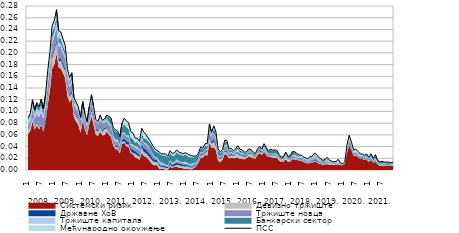
| Category | ПСС |
|---|---|
| 0 | 0.089 |
| 1 | 0.097 |
| 2 | 0.12 |
| 3 | 0.102 |
| 4 | 0.115 |
| 5 | 0.108 |
| 6 | 0.121 |
| 7 | 0.104 |
| 8 | 0.129 |
| 9 | 0.17 |
| 10 | 0.202 |
| 11 | 0.246 |
| 12 | 0.255 |
| 13 | 0.274 |
| 14 | 0.238 |
| 15 | 0.235 |
| 16 | 0.223 |
| 17 | 0.213 |
| 18 | 0.173 |
| 19 | 0.158 |
| 20 | 0.166 |
| 21 | 0.124 |
| 22 | 0.116 |
| 23 | 0.108 |
| 24 | 0.09 |
| 25 | 0.117 |
| 26 | 0.097 |
| 27 | 0.082 |
| 28 | 0.108 |
| 29 | 0.129 |
| 30 | 0.108 |
| 31 | 0.086 |
| 32 | 0.083 |
| 33 | 0.094 |
| 34 | 0.085 |
| 35 | 0.087 |
| 36 | 0.094 |
| 37 | 0.092 |
| 38 | 0.089 |
| 39 | 0.072 |
| 40 | 0.068 |
| 41 | 0.067 |
| 42 | 0.057 |
| 43 | 0.08 |
| 44 | 0.088 |
| 45 | 0.084 |
| 46 | 0.081 |
| 47 | 0.066 |
| 48 | 0.063 |
| 49 | 0.055 |
| 50 | 0.054 |
| 51 | 0.049 |
| 52 | 0.071 |
| 53 | 0.064 |
| 54 | 0.061 |
| 55 | 0.054 |
| 56 | 0.049 |
| 57 | 0.043 |
| 58 | 0.036 |
| 59 | 0.033 |
| 60 | 0.031 |
| 61 | 0.028 |
| 62 | 0.028 |
| 63 | 0.027 |
| 64 | 0.023 |
| 65 | 0.033 |
| 66 | 0.028 |
| 67 | 0.029 |
| 68 | 0.034 |
| 69 | 0.03 |
| 70 | 0.029 |
| 71 | 0.028 |
| 72 | 0.03 |
| 73 | 0.028 |
| 74 | 0.026 |
| 75 | 0.024 |
| 76 | 0.024 |
| 77 | 0.024 |
| 78 | 0.029 |
| 79 | 0.039 |
| 80 | 0.037 |
| 81 | 0.045 |
| 82 | 0.045 |
| 83 | 0.079 |
| 84 | 0.064 |
| 85 | 0.075 |
| 86 | 0.065 |
| 87 | 0.036 |
| 88 | 0.031 |
| 89 | 0.035 |
| 90 | 0.051 |
| 91 | 0.05 |
| 92 | 0.036 |
| 93 | 0.037 |
| 94 | 0.033 |
| 95 | 0.036 |
| 96 | 0.042 |
| 97 | 0.035 |
| 98 | 0.034 |
| 99 | 0.03 |
| 100 | 0.031 |
| 101 | 0.036 |
| 102 | 0.035 |
| 103 | 0.031 |
| 104 | 0.028 |
| 105 | 0.036 |
| 106 | 0.041 |
| 107 | 0.036 |
| 108 | 0.045 |
| 109 | 0.039 |
| 110 | 0.032 |
| 111 | 0.036 |
| 112 | 0.034 |
| 113 | 0.034 |
| 114 | 0.033 |
| 115 | 0.026 |
| 116 | 0.022 |
| 117 | 0.024 |
| 118 | 0.031 |
| 119 | 0.023 |
| 120 | 0.025 |
| 121 | 0.032 |
| 122 | 0.031 |
| 123 | 0.028 |
| 124 | 0.025 |
| 125 | 0.026 |
| 126 | 0.022 |
| 127 | 0.021 |
| 128 | 0.019 |
| 129 | 0.022 |
| 130 | 0.023 |
| 131 | 0.029 |
| 132 | 0.027 |
| 133 | 0.021 |
| 134 | 0.019 |
| 135 | 0.016 |
| 136 | 0.018 |
| 137 | 0.021 |
| 138 | 0.016 |
| 139 | 0.015 |
| 140 | 0.014 |
| 141 | 0.015 |
| 142 | 0.018 |
| 143 | 0.012 |
| 144 | 0.011 |
| 145 | 0.014 |
| 146 | 0.043 |
| 147 | 0.059 |
| 148 | 0.048 |
| 149 | 0.034 |
| 150 | 0.036 |
| 151 | 0.032 |
| 152 | 0.027 |
| 153 | 0.027 |
| 154 | 0.025 |
| 155 | 0.027 |
| 156 | 0.022 |
| 157 | 0.028 |
| 158 | 0.02 |
| 159 | 0.026 |
| 160 | 0.017 |
| 161 | 0.014 |
| 162 | 0.015 |
| 163 | 0.013 |
| 164 | 0.014 |
| 165 | 0.014 |
| 166 | 0.013 |
| 167 | 0.013 |